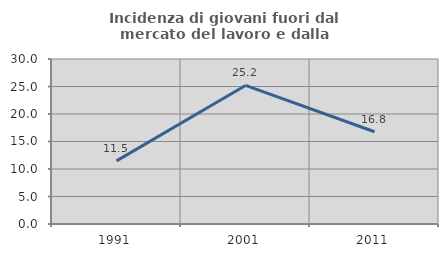
| Category | Incidenza di giovani fuori dal mercato del lavoro e dalla formazione  |
|---|---|
| 1991.0 | 11.47 |
| 2001.0 | 25.191 |
| 2011.0 | 16.774 |